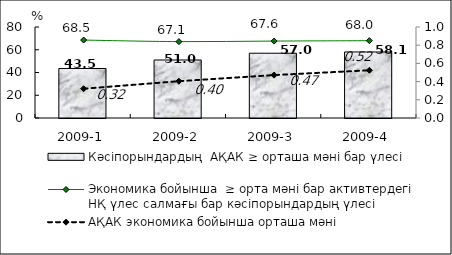
| Category | Кәсіпорындардың  АҚАК ≥ орташа мәні бар үлесі  |
|---|---|
| 2009-1 | 43.54 |
| 2009-2 | 51 |
| 2009-3 | 56.95 |
| 2009-4 | 58.05 |